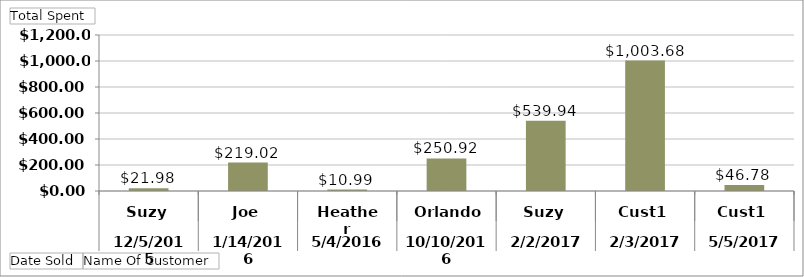
| Category | Total |
|---|---|
| 0 | 21.98 |
| 1 | 219.02 |
| 2 | 10.99 |
| 3 | 250.92 |
| 4 | 539.94 |
| 5 | 1003.68 |
| 6 | 46.78 |